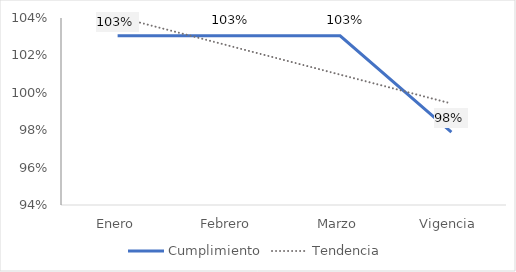
| Category | Cumplimiento |
|---|---|
| Enero | 1.03 |
| Febrero | 1.03 |
| Marzo | 1.03 |
| Vigencia | 0.979 |